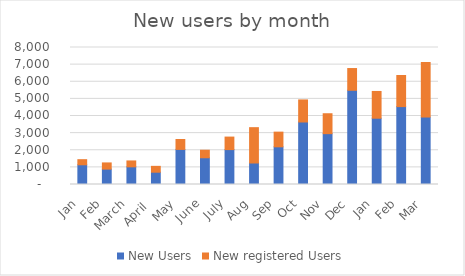
| Category | New Users | New registered Users |
|---|---|---|
|  Jan  | 1151 | 298 |
|  Feb  | 899 | 361 |
|  March  | 1032 | 344 |
|  April   | 718 | 342 |
|  May  | 2049 | 580 |
|  June  | 1561 | 440 |
|  July  | 2039 | 730 |
|  Aug  | 1255 | 2064 |
|  Sep  | 2200 | 858 |
|  Oct  | 3650 | 1289 |
|  Nov  | 2969 | 1163 |
|  Dec  | 5502 | 1269 |
|  Jan  | 3871 | 1562 |
|  Feb  | 4548 | 1816 |
|  Mar  | 3940 | 3185 |